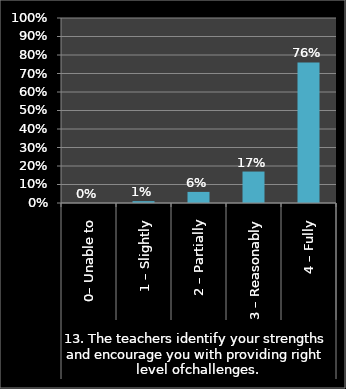
| Category | Series 0 |
|---|---|
| 0 | 0 |
| 1 | 0.01 |
| 2 | 0.06 |
| 3 | 0.17 |
| 4 | 0.76 |